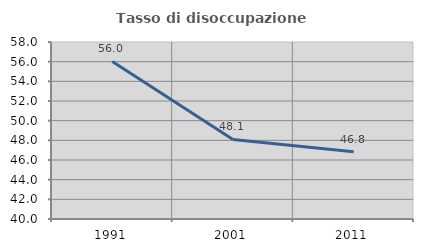
| Category | Tasso di disoccupazione giovanile  |
|---|---|
| 1991.0 | 56.019 |
| 2001.0 | 48.087 |
| 2011.0 | 46.847 |